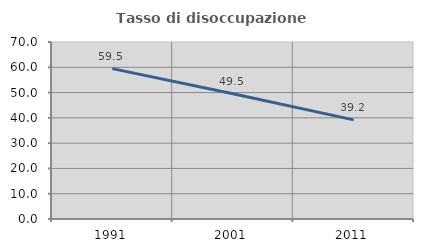
| Category | Tasso di disoccupazione giovanile  |
|---|---|
| 1991.0 | 59.459 |
| 2001.0 | 49.55 |
| 2011.0 | 39.189 |